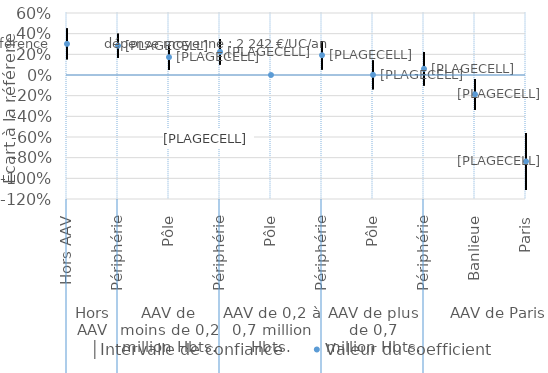
| Category | │Intervalle de confiance | Series 1 | Valeur du coefficient |
|---|---|---|---|
| 0 | 0.45 | 0.152 | 0.301 |
| 1 | 0.398 | 0.168 | 0.283 |
| 2 | 0.293 | 0.052 | 0.173 |
| 3 | 0.348 | 0.101 | 0.224 |
| 4 | 0 | 0 | 0 |
| 5 | 0.33 | 0.053 | 0.192 |
| 6 | 0.141 | -0.138 | 0.002 |
| 7 | 0.222 | -0.102 | 0.06 |
| 8 | -0.039 | -0.336 | -0.187 |
| 9 | -0.56 | -1.113 | -0.837 |